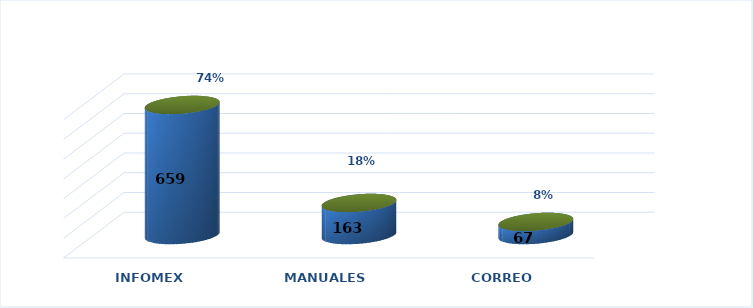
| Category | Series 0 | Series 1 |
|---|---|---|
| INFOMEX | 659 | 0.741 |
| MANUALES | 163 | 0.183 |
| CORREO | 67 | 0.075 |